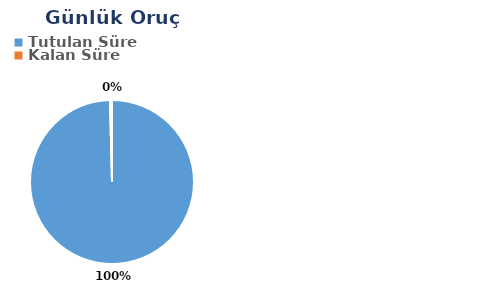
| Category | Günlük |
|---|---|
| Tutulan Süre | 0.584 |
| Kalan Süre | 0.002 |